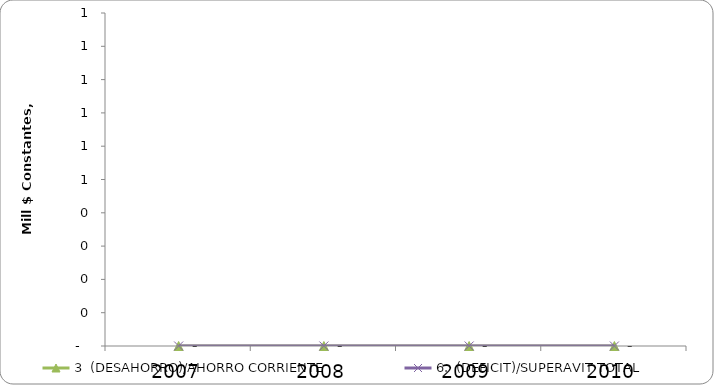
| Category | 3  (DESAHORRO)/AHORRO CORRIENTE | 6.  (DEFICIT)/SUPERAVIT TOTAL |
|---|---|---|
| 2007 | 0 | 0 |
| 2008 | 0 | 0 |
| 2009 | 0 | 0 |
| 2010 | 0 | 0 |